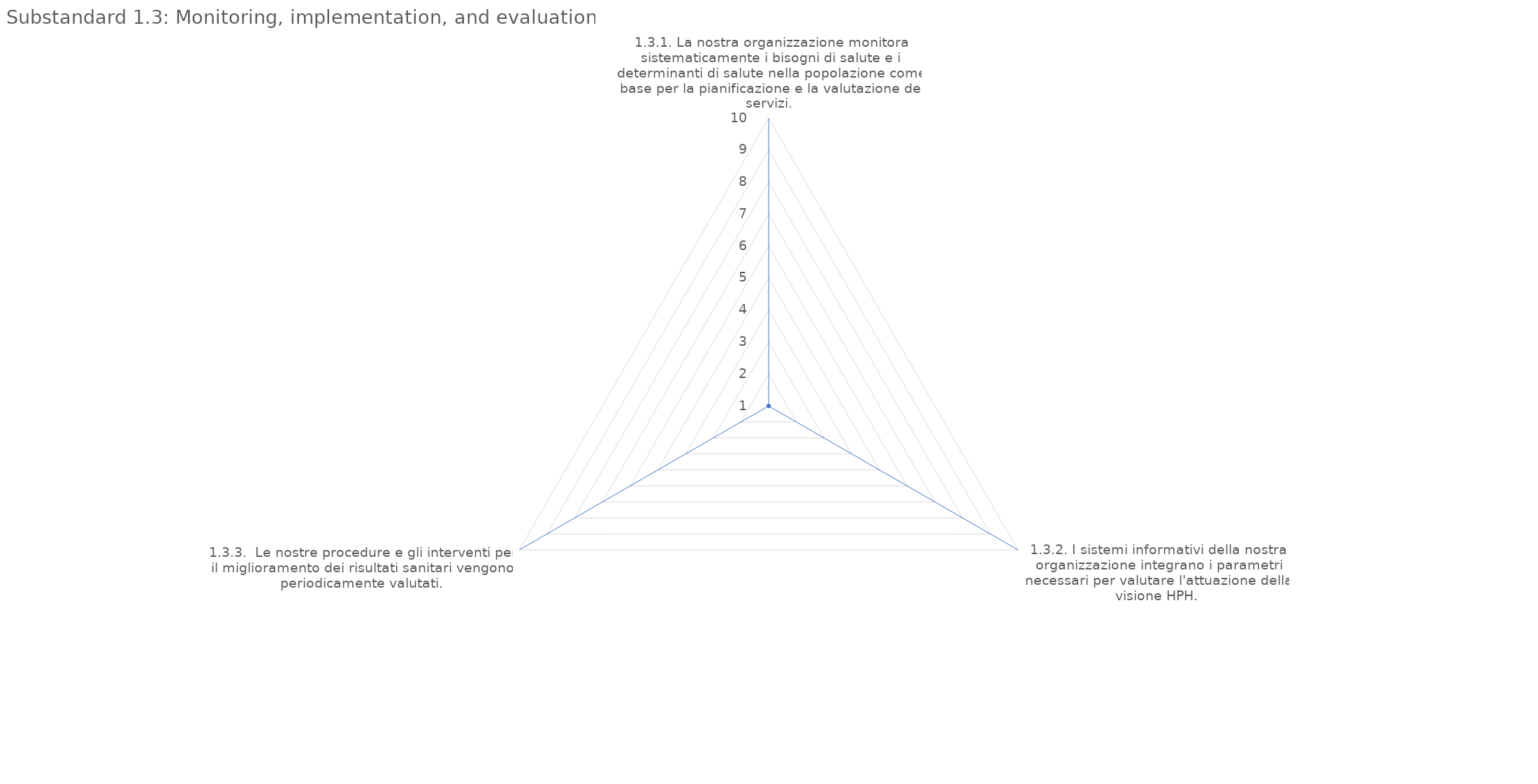
| Category | value |
|---|---|
| 1.3.1. La nostra organizzazione monitora sistematicamente i bisogni di salute e i determinanti di salute nella popolazione come base per la pianificazione e la valutazione dei servizi. | 1 |
| 1.3.2. I sistemi informativi della nostra organizzazione integrano i parametri necessari per valutare l'attuazione della visione HPH. | 1 |
| 1.3.3.  Le nostre procedure e gli interventi per il miglioramento dei risultati sanitari vengono periodicamente valutati. | 1 |